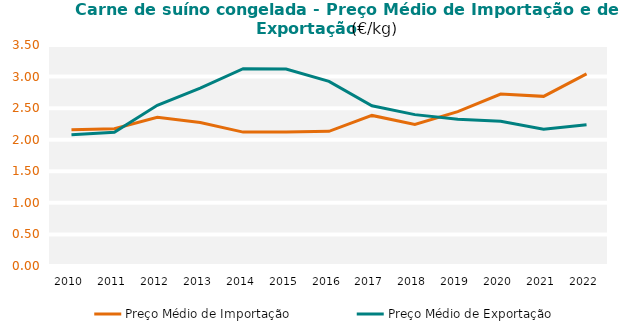
| Category | Preço Médio de Importação | Preço Médio de Exportação |
|---|---|---|
| 2010.0 | 2.156 | 2.077 |
| 2011.0 | 2.175 | 2.118 |
| 2012.0 | 2.354 | 2.544 |
| 2013.0 | 2.272 | 2.816 |
| 2014.0 | 2.12 | 3.125 |
| 2015.0 | 2.12 | 3.118 |
| 2016.0 | 2.133 | 2.925 |
| 2017.0 | 2.385 | 2.537 |
| 2018.0 | 2.24 | 2.397 |
| 2019.0 | 2.444 | 2.324 |
| 2020.0 | 2.722 | 2.294 |
| 2021.0 | 2.686 | 2.166 |
| 2022.0 | 3.043 | 2.238 |